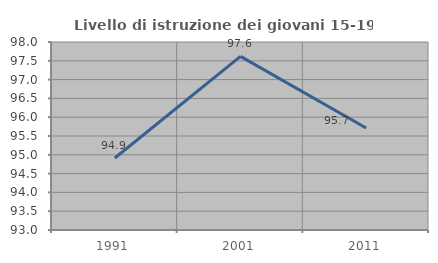
| Category | Livello di istruzione dei giovani 15-19 anni |
|---|---|
| 1991.0 | 94.915 |
| 2001.0 | 97.619 |
| 2011.0 | 95.714 |